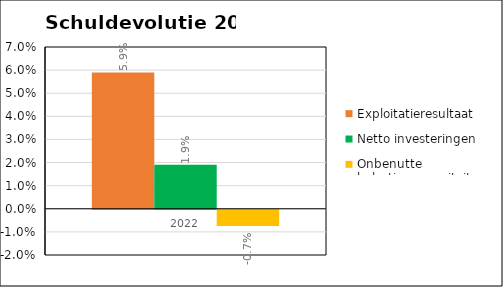
| Category | Exploitatieresultaat | Netto investeringen | Onbenutte belastingcapaciteit |
|---|---|---|---|
| 2022.0 | 0.059 | 0.019 | -0.007 |